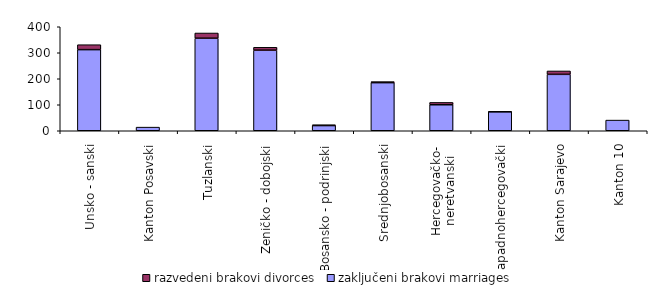
| Category | zaključeni brakovi marriages | razvedeni brakovi divorces |
|---|---|---|
| Unsko - sanski | 312 | 19 |
| Kanton Posavski | 14 | 0 |
| Tuzlanski | 356 | 20 |
| Zeničko - dobojski | 310 | 11 |
| Bosansko - podrinjski | 20 | 3 |
| Srednjobosanski | 185 | 4 |
| Hercegovačko-
neretvanski | 100 | 9 |
| Zapadnohercegovački | 73 | 1 |
| Kanton Sarajevo | 217 | 13 |
| Kanton 10 | 41 | 0 |